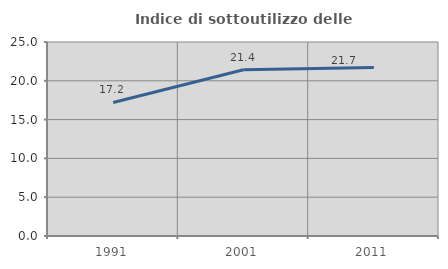
| Category | Indice di sottoutilizzo delle abitazioni  |
|---|---|
| 1991.0 | 17.205 |
| 2001.0 | 21.425 |
| 2011.0 | 21.715 |